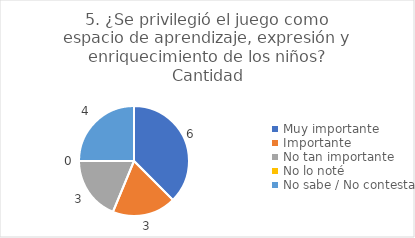
| Category | 5. ¿Se privilegió el juego como espacio de aprendizaje, expresión y enriquecimiento de los niños? |
|---|---|
| Muy importante  | 0.375 |
| Importante  | 0.188 |
| No tan importante  | 0.188 |
| No lo noté  | 0 |
| No sabe / No contesta | 0.25 |